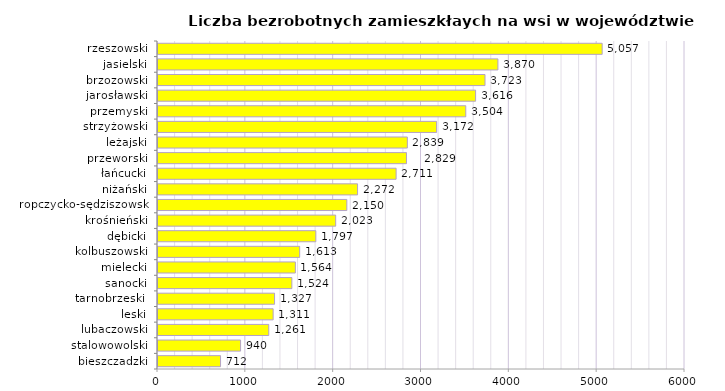
| Category | Liczba bezrobotnych zamieszkłaych na wsi w województwie podkarpackim |
|---|---|
| bieszczadzki | 712 |
| stalowowolski | 940 |
| lubaczowski | 1261 |
| leski | 1311 |
| tarnobrzeski  | 1327 |
| sanocki | 1524 |
| mielecki | 1564 |
| kolbuszowski | 1613 |
| dębicki | 1797 |
| krośnieński | 2023 |
| ropczycko-sędziszowski | 2150 |
| niżański | 2272 |
| łańcucki | 2711 |
| przeworski | 2829 |
| leżajski | 2839 |
| strzyżowski | 3172 |
| przemyski | 3504 |
| jarosławski | 3616 |
| brzozowski | 3723 |
| jasielski | 3870 |
| rzeszowski | 5057 |